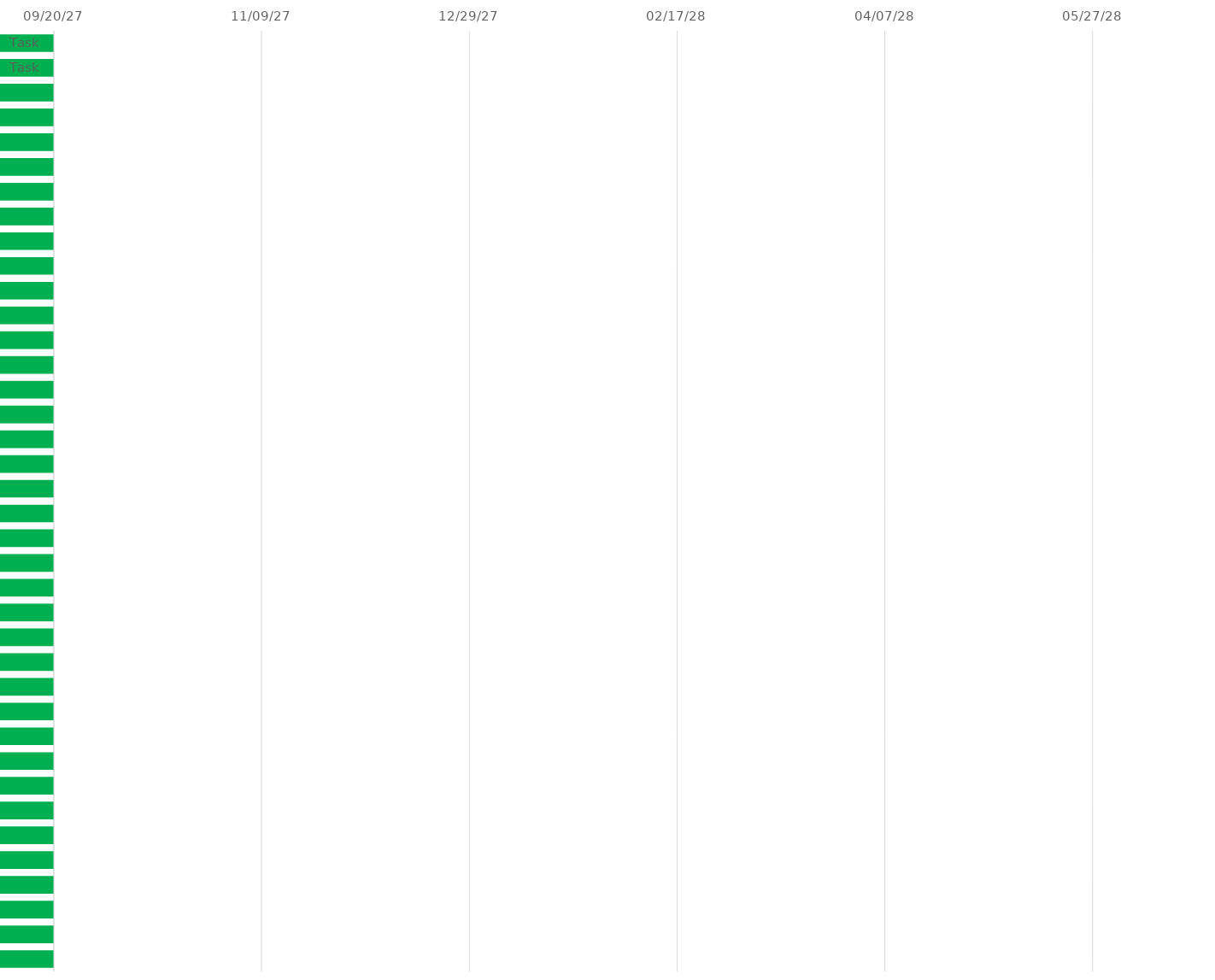
| Category | START 
DATE | Duration |
|---|---|---|
| Task |  | 1 |
| Task |  | 1 |